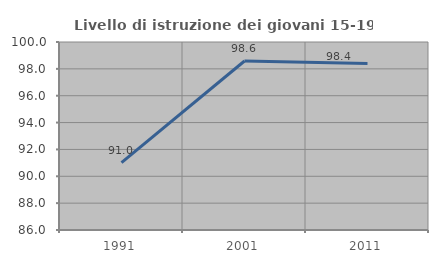
| Category | Livello di istruzione dei giovani 15-19 anni |
|---|---|
| 1991.0 | 91.022 |
| 2001.0 | 98.584 |
| 2011.0 | 98.4 |